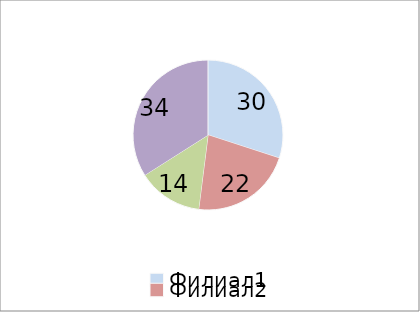
| Category | Прибыль |
|---|---|
| Филиал1 | 6 |
| Филиал2 | 4.4 |
| Филиал3 | 2.8 |
| Филиал4 | 6.8 |